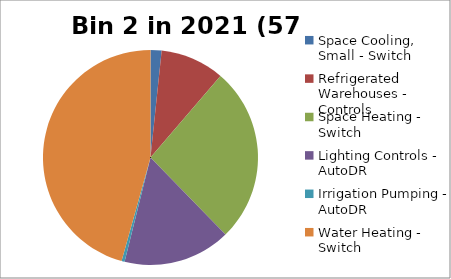
| Category | Series 0 |
|---|---|
| Space Cooling, Small - Switch | 0.005 |
| Refrigerated Warehouses - Controls | 0.027 |
| Space Heating - Switch | 0.074 |
| Lighting Controls - AutoDR | 0.046 |
| Irrigation Pumping - AutoDR | 0.001 |
| Water Heating - Switch | 0.129 |